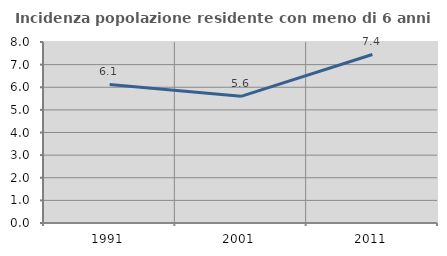
| Category | Incidenza popolazione residente con meno di 6 anni |
|---|---|
| 1991.0 | 6.124 |
| 2001.0 | 5.598 |
| 2011.0 | 7.45 |